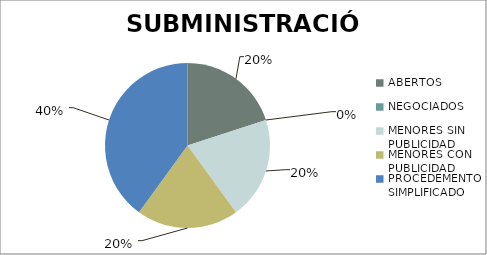
| Category | Series 0 |
|---|---|
| ABERTOS  | 1 |
| NEGOCIADOS  | 0 |
| MENORES SIN PUBLICIDAD | 1 |
| MENORES CON PUBLICIDAD | 1 |
| PROCEDEMENTO SIMPLIFICADO | 2 |